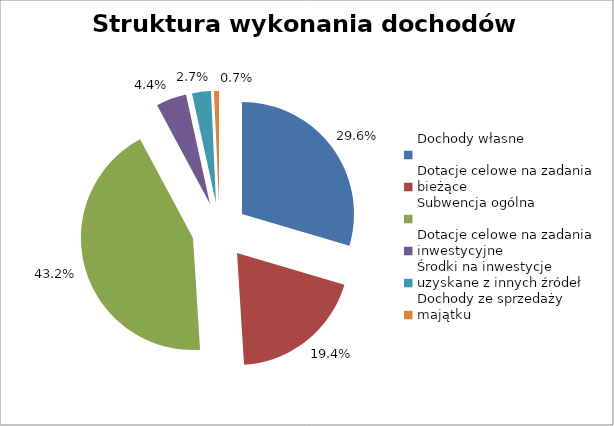
| Category | Dochody 
wykonane
(wpływy minus zwroty) |
|---|---|
| Dochody własne | 4486357.09 |
| Dotacje celowe na zadania bieżące | 2945942.2 |
| Subwencja ogólna | 6549388 |
| Dotacje celowe na zadania inwestycyjne | 666000 |
| Środki na inwestycje uzyskane z innych źródeł | 412850.45 |
| Dochody ze sprzedaży majątku | 108959.2 |